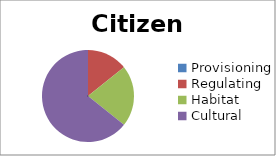
| Category | Citizens | Total |
|---|---|---|
| Provisioning | 12 | 23 |
| Regulating | 19 | 40 |
| Habitat | 17 | 31 |
| Cultural | 42 | 52 |